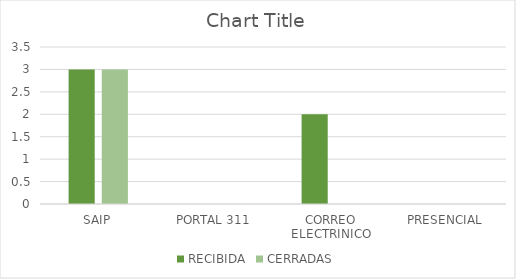
| Category | RECIBIDA | CERRADAS |
|---|---|---|
| SAIP | 3 | 3 |
| PORTAL 311 | 0 | 0 |
| CORREO ELECTRINICO | 2 | 0 |
| PRESENCIAL  | 0 | 0 |